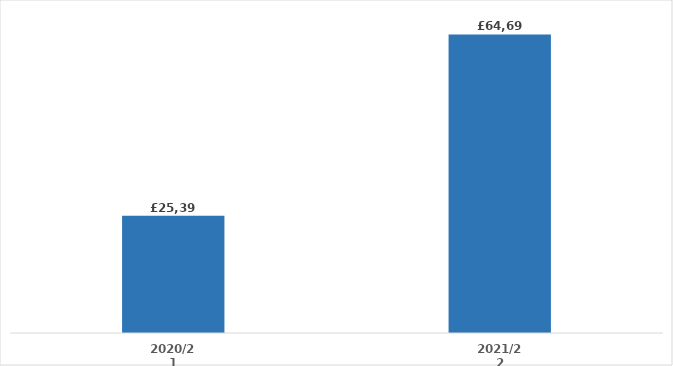
| Category | Series 0 |
|---|---|
| 2020/21 | 25392.14 |
| 2021/22 | 64698.34 |